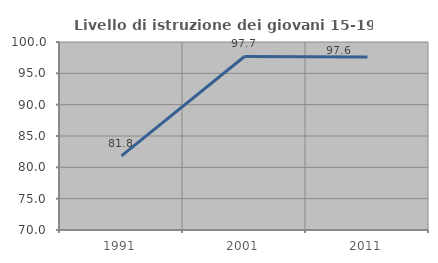
| Category | Livello di istruzione dei giovani 15-19 anni |
|---|---|
| 1991.0 | 81.833 |
| 2001.0 | 97.688 |
| 2011.0 | 97.596 |